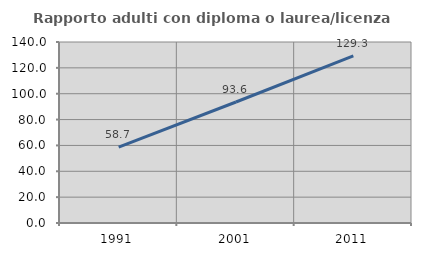
| Category | Rapporto adulti con diploma o laurea/licenza media  |
|---|---|
| 1991.0 | 58.659 |
| 2001.0 | 93.6 |
| 2011.0 | 129.31 |